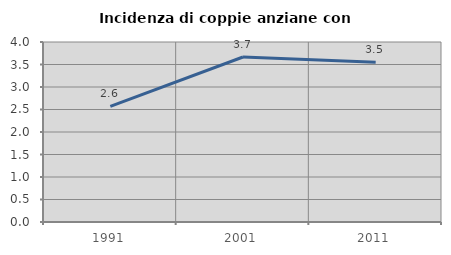
| Category | Incidenza di coppie anziane con figli |
|---|---|
| 1991.0 | 2.569 |
| 2001.0 | 3.666 |
| 2011.0 | 3.549 |